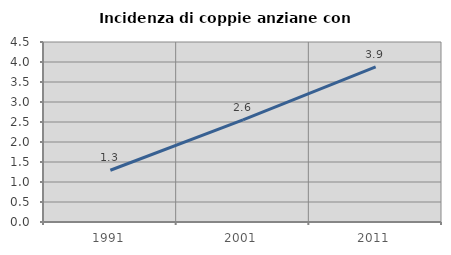
| Category | Incidenza di coppie anziane con figli |
|---|---|
| 1991.0 | 1.294 |
| 2001.0 | 2.552 |
| 2011.0 | 3.876 |